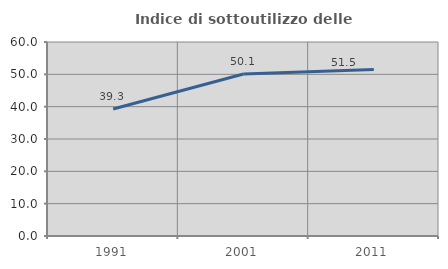
| Category | Indice di sottoutilizzo delle abitazioni  |
|---|---|
| 1991.0 | 39.286 |
| 2001.0 | 50.081 |
| 2011.0 | 51.488 |